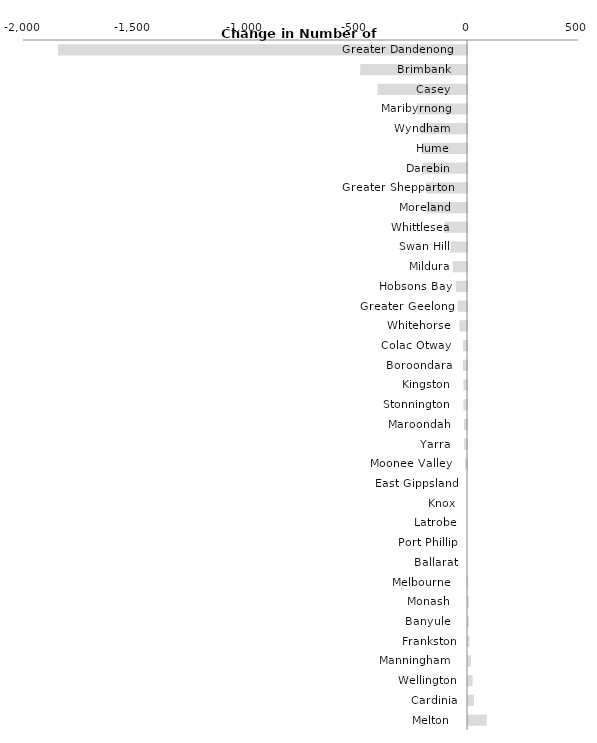
| Category | Series 0 |
|---|---|
| Greater Dandenong   | -1842 |
| Brimbank   | -481 |
| Casey   | -403 |
| Maribyrnong   | -226 |
| Wyndham   | -209 |
| Hume   | -204 |
| Darebin   | -202 |
| Greater Shepparton   | -185 |
| Moreland   | -184 |
| Whittlesea   | -101 |
| Swan Hill   | -74 |
| Mildura   | -64 |
| Hobsons Bay   | -49 |
| Greater Geelong   | -42 |
| Whitehorse   | -34 |
| Colac Otway   | -18 |
| Boroondara   | -18 |
| Kingston   | -16 |
| Stonnington   | -16 |
| Maroondah   | -14 |
| Yarra   | -13 |
| Moonee Valley   | -9 |
| East Gippsland | 0 |
| Knox | 0 |
| Latrobe | 0 |
| Port Phillip | 0 |
| Ballarat | 0 |
| Melbourne   | 1 |
| Monash   | 4 |
| Banyule   | 4 |
| Frankston | 7 |
| Manningham   | 13 |
| Wellington | 21 |
| Cardinia | 27 |
| Melton   | 85 |